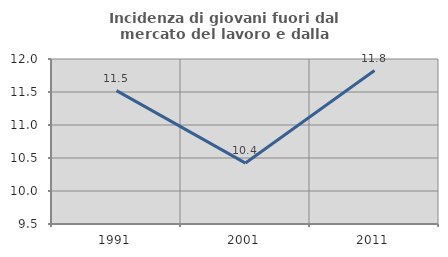
| Category | Incidenza di giovani fuori dal mercato del lavoro e dalla formazione  |
|---|---|
| 1991.0 | 11.521 |
| 2001.0 | 10.423 |
| 2011.0 | 11.826 |